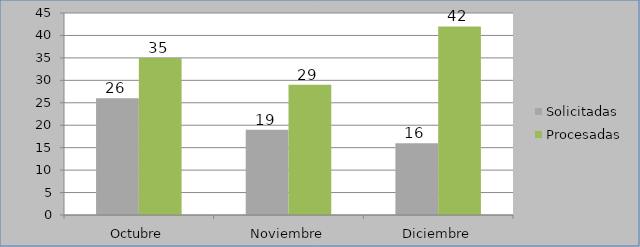
| Category | Solicitadas | Procesadas |
|---|---|---|
| Octubre | 26 | 35 |
| Noviembre | 19 | 29 |
| Diciembre | 16 | 42 |